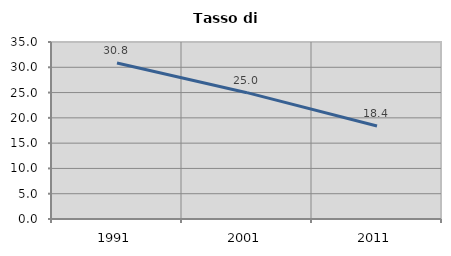
| Category | Tasso di disoccupazione   |
|---|---|
| 1991.0 | 30.831 |
| 2001.0 | 24.981 |
| 2011.0 | 18.378 |